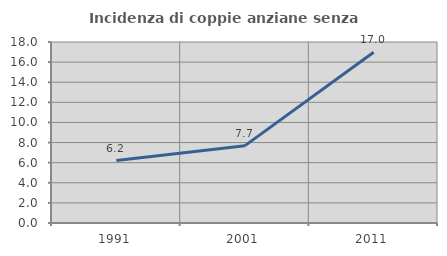
| Category | Incidenza di coppie anziane senza figli  |
|---|---|
| 1991.0 | 6.215 |
| 2001.0 | 7.692 |
| 2011.0 | 16.981 |